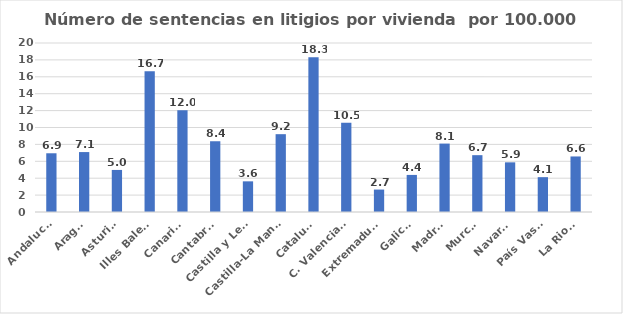
| Category | Número de sentencias en litigios por vivienda  por 100.000 habitantes |
|---|---|
| Andalucía | 6.95 |
| Aragón | 7.093 |
| Asturias | 4.978 |
| Illes Balears | 16.663 |
| Canarias | 12.038 |
| Cantabria | 8.373 |
| Castilla y León | 3.629 |
| Castilla-La Mancha | 9.21 |
| Cataluña | 18.321 |
| C. Valenciana | 10.548 |
| Extremadura | 2.656 |
| Galicia | 4.388 |
| Madrid | 8.096 |
| Murcia | 6.726 |
| Navarra | 5.877 |
| País Vasco | 4.123 |
| La Rioja | 6.573 |